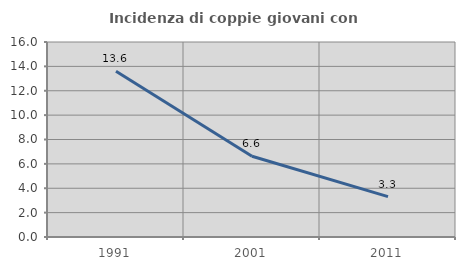
| Category | Incidenza di coppie giovani con figli |
|---|---|
| 1991.0 | 13.596 |
| 2001.0 | 6.623 |
| 2011.0 | 3.313 |